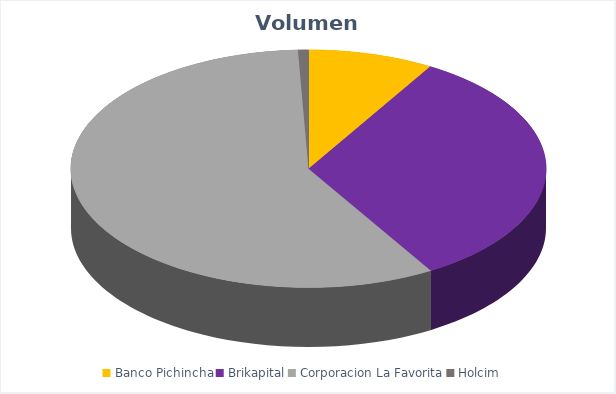
| Category | VOLUMEN ($USD) |
|---|---|
| Banco Pichincha | 4158 |
| Brikapital | 16000 |
| Corporacion La Favorita | 28175.84 |
| Holcim | 345 |